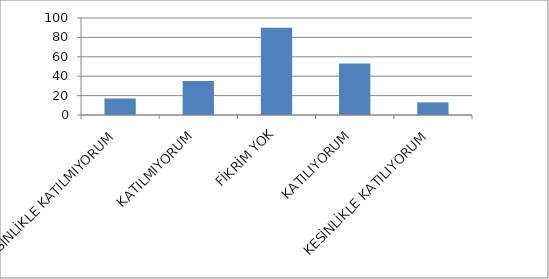
| Category | Series 0 |
|---|---|
| KESİNLİKLE KATILMIYORUM | 17 |
| KATILMIYORUM | 35 |
| FİKRİM YOK | 90 |
| KATILIYORUM | 53 |
| KESİNLİKLE KATILIYORUM | 13 |